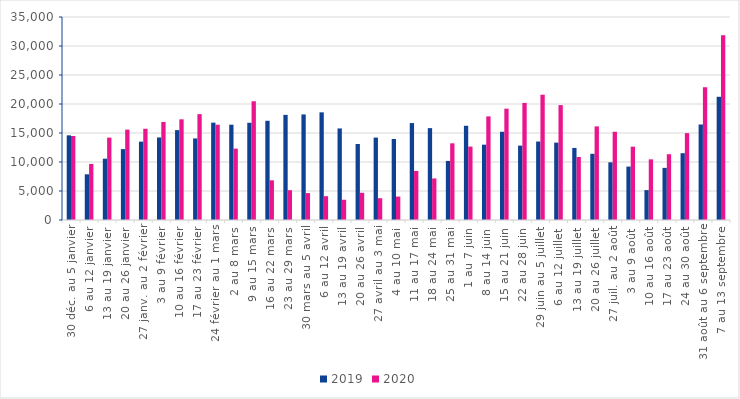
| Category | 2019 | 2020 |
|---|---|---|
| 30 déc. au 5 janvier | 14597 | 14482 |
| 6 au 12 janvier | 7879 | 9666 |
| 13 au 19 janvier | 10570 | 14205 |
| 20 au 26 janvier | 12222 | 15581 |
| 27 janv. au 2 février | 13510 | 15731 |
| 3 au 9 février | 14232 | 16900 |
| 10 au 16 février | 15499 | 17359 |
| 17 au 23 février | 14063 | 18254 |
| 24 février au 1 mars | 16783 | 16433 |
| 2 au 8 mars | 16432 | 12305 |
| 9 au 15 mars | 16765 | 20473 |
| 16 au 22 mars | 17107 | 6840 |
| 23 au 29 mars | 18126 | 5141 |
| 30 mars au 5 avril | 18204 | 4637 |
| 6 au 12 avril | 18560 | 4103 |
| 13 au 19 avril | 15788 | 3491 |
| 20 au 26 avril | 13099 | 4695 |
| 27 avril au 3 mai | 14207 | 3754 |
| 4 au 10 mai | 13969 | 4040 |
| 11 au 17 mai | 16713 | 8452 |
| 18 au 24 mai | 15841 | 7162 |
| 25 au 31 mai | 10184 | 13219 |
| 1 au 7 juin | 16246 | 12661 |
| 8 au 14 juin | 12988 | 17864 |
| 15 au 21 juin | 15214 | 19196 |
| 22 au 28 juin | 12823 | 20190 |
| 29 juin au 5 juillet | 13531 | 21602 |
| 6 au 12 juillet | 13339 | 19806 |
| 13 au 19 juillet | 12424 | 10860 |
| 20 au 26 juillet | 11414 | 16140 |
| 27 juil. au 2 août | 9944 | 15214 |
| 3 au 9 août | 9210 | 12641 |
| 10 au 16 août | 5155 | 10456 |
| 17 au 23 août | 8985 | 11341 |
| 24 au 30 août | 11520 | 14975 |
| 31 août au 6 septembre | 16465 | 22908 |
| 7 au 13 septembre | 21242 | 31866 |